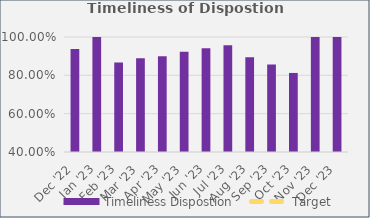
| Category | Timeliness Dispostion |
|---|---|
| Dec '22 | 0.938 |
| Jan '23 | 1 |
| Feb '23 | 0.867 |
| Mar '23 | 0.889 |
| Apr '23 | 0.9 |
| May '23 | 0.923 |
| Jun '23 | 0.941 |
| Jul '23 | 0.957 |
| Aug '23 | 0.895 |
| Sep '23 | 0.857 |
| Oct '23 | 0.812 |
| Nov '23 | 1 |
| Dec '23 | 1 |